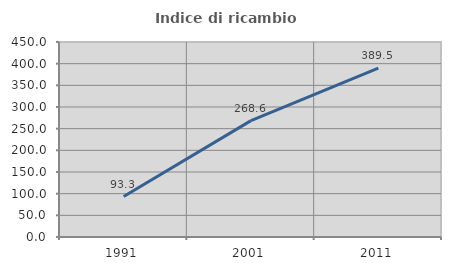
| Category | Indice di ricambio occupazionale  |
|---|---|
| 1991.0 | 93.277 |
| 2001.0 | 268.571 |
| 2011.0 | 389.474 |